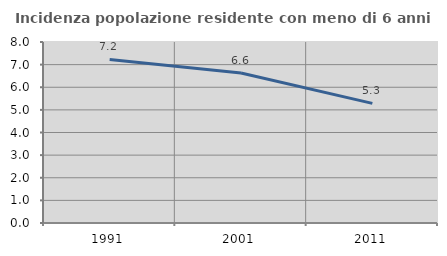
| Category | Incidenza popolazione residente con meno di 6 anni |
|---|---|
| 1991.0 | 7.229 |
| 2001.0 | 6.63 |
| 2011.0 | 5.288 |